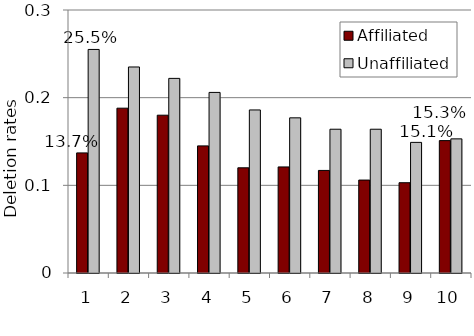
| Category | Affiliated | Unaffiliated |
|---|---|---|
| 0 | 0.137 | 0.255 |
| 1 | 0.188 | 0.235 |
| 2 | 0.18 | 0.222 |
| 3 | 0.145 | 0.206 |
| 4 | 0.12 | 0.186 |
| 5 | 0.121 | 0.177 |
| 6 | 0.117 | 0.164 |
| 7 | 0.106 | 0.164 |
| 8 | 0.103 | 0.149 |
| 9 | 0.151 | 0.153 |